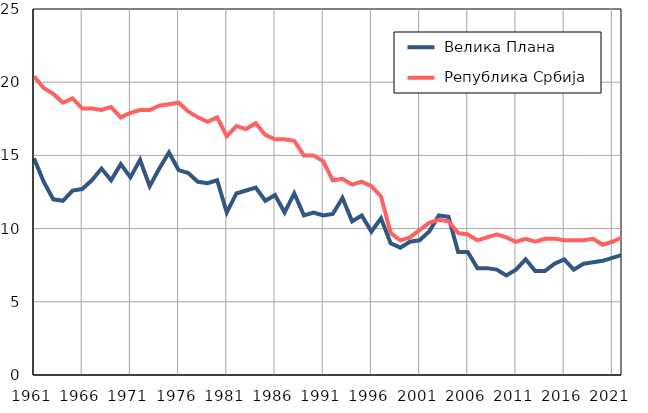
| Category |  Велика Плана |  Република Србија |
|---|---|---|
| 1961.0 | 14.8 | 20.4 |
| 1962.0 | 13.2 | 19.6 |
| 1963.0 | 12 | 19.2 |
| 1964.0 | 11.9 | 18.6 |
| 1965.0 | 12.6 | 18.9 |
| 1966.0 | 12.7 | 18.2 |
| 1967.0 | 13.3 | 18.2 |
| 1968.0 | 14.1 | 18.1 |
| 1969.0 | 13.3 | 18.3 |
| 1970.0 | 14.4 | 17.6 |
| 1971.0 | 13.5 | 17.9 |
| 1972.0 | 14.7 | 18.1 |
| 1973.0 | 12.9 | 18.1 |
| 1974.0 | 14.1 | 18.4 |
| 1975.0 | 15.2 | 18.5 |
| 1976.0 | 14 | 18.6 |
| 1977.0 | 13.8 | 18 |
| 1978.0 | 13.2 | 17.6 |
| 1979.0 | 13.1 | 17.3 |
| 1980.0 | 13.3 | 17.6 |
| 1981.0 | 11.1 | 16.3 |
| 1982.0 | 12.4 | 17 |
| 1983.0 | 12.6 | 16.8 |
| 1984.0 | 12.8 | 17.2 |
| 1985.0 | 11.9 | 16.4 |
| 1986.0 | 12.3 | 16.1 |
| 1987.0 | 11.1 | 16.1 |
| 1988.0 | 12.4 | 16 |
| 1989.0 | 10.9 | 15 |
| 1990.0 | 11.1 | 15 |
| 1991.0 | 10.9 | 14.6 |
| 1992.0 | 11 | 13.3 |
| 1993.0 | 12.1 | 13.4 |
| 1994.0 | 10.5 | 13 |
| 1995.0 | 10.9 | 13.2 |
| 1996.0 | 9.8 | 12.9 |
| 1997.0 | 10.7 | 12.2 |
| 1998.0 | 9 | 9.7 |
| 1999.0 | 8.7 | 9.2 |
| 2000.0 | 9.1 | 9.4 |
| 2001.0 | 9.2 | 9.9 |
| 2002.0 | 9.8 | 10.4 |
| 2003.0 | 10.9 | 10.6 |
| 2004.0 | 10.8 | 10.5 |
| 2005.0 | 8.4 | 9.7 |
| 2006.0 | 8.4 | 9.6 |
| 2007.0 | 7.3 | 9.2 |
| 2008.0 | 7.3 | 9.4 |
| 2009.0 | 7.2 | 9.6 |
| 2010.0 | 6.8 | 9.4 |
| 2011.0 | 7.2 | 9.1 |
| 2012.0 | 7.9 | 9.3 |
| 2013.0 | 7.1 | 9.1 |
| 2014.0 | 7.1 | 9.3 |
| 2015.0 | 7.6 | 9.3 |
| 2016.0 | 7.9 | 9.2 |
| 2017.0 | 7.2 | 9.2 |
| 2018.0 | 7.6 | 9.2 |
| 2019.0 | 7.7 | 9.3 |
| 2020.0 | 7.8 | 8.9 |
| 2021.0 | 8 | 9.1 |
| 2022.0 | 8.2 | 9.4 |